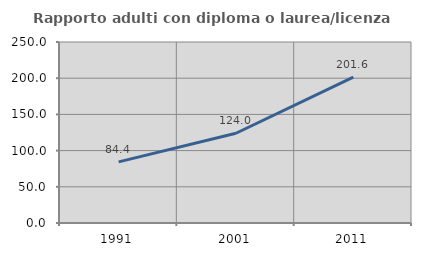
| Category | Rapporto adulti con diploma o laurea/licenza media  |
|---|---|
| 1991.0 | 84.444 |
| 2001.0 | 123.958 |
| 2011.0 | 201.6 |